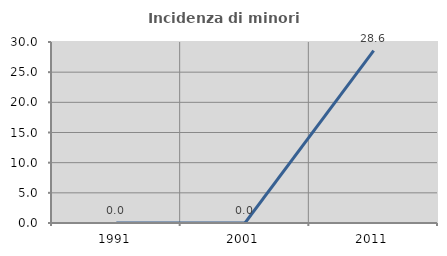
| Category | Incidenza di minori stranieri |
|---|---|
| 1991.0 | 0 |
| 2001.0 | 0 |
| 2011.0 | 28.571 |